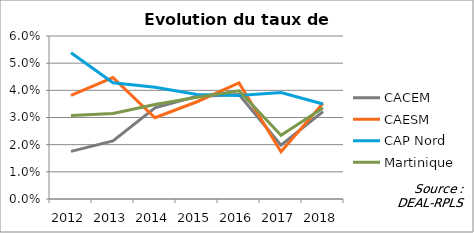
| Category | CACEM | CAESM | CAP Nord | Martinique |
|---|---|---|---|---|
| 2012.0 | 0.018 | 0.038 | 0.054 | 0.031 |
| 2013.0 | 0.021 | 0.045 | 0.043 | 0.032 |
| 2014.0 | 0.034 | 0.03 | 0.041 | 0.035 |
| 2015.0 | 0.038 | 0.036 | 0.038 | 0.037 |
| 2016.0 | 0.038 | 0.043 | 0.038 | 0.04 |
| 2017.0 | 0.02 | 0.017 | 0.039 | 0.023 |
| 2018.0 | 0.032 | 0.035 | 0.035 | 0.034 |